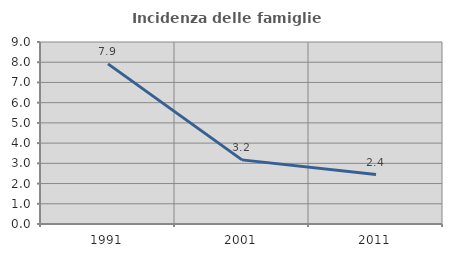
| Category | Incidenza delle famiglie numerose |
|---|---|
| 1991.0 | 7.918 |
| 2001.0 | 3.171 |
| 2011.0 | 2.445 |